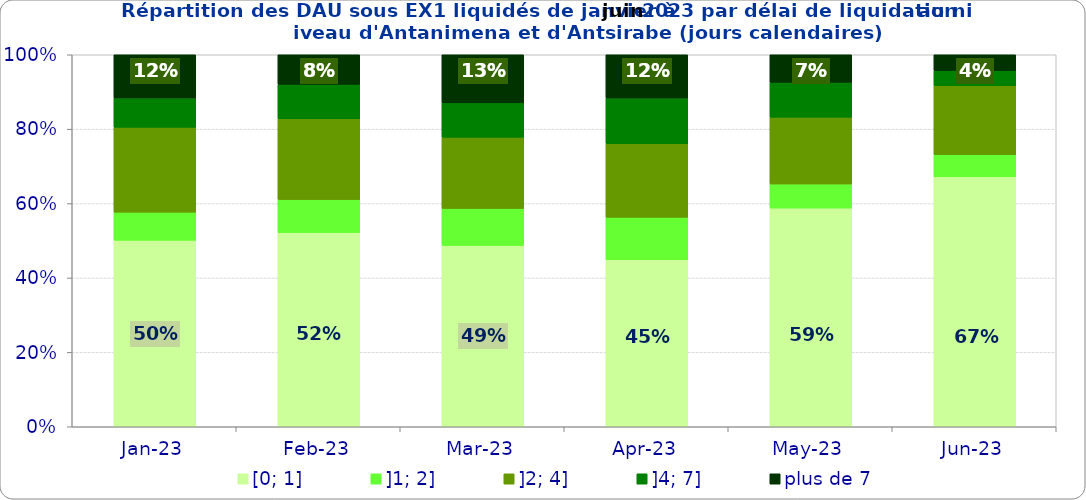
| Category | [0; 1] | ]1; 2] | ]2; 4] | ]4; 7] | plus de 7 |
|---|---|---|---|---|---|
| 2023-01-01 | 0.501 | 0.076 | 0.228 | 0.079 | 0.116 |
| 2023-02-01 | 0.522 | 0.089 | 0.217 | 0.093 | 0.08 |
| 2023-03-01 | 0.487 | 0.1 | 0.191 | 0.092 | 0.129 |
| 2023-04-01 | 0.449 | 0.114 | 0.198 | 0.123 | 0.116 |
| 2023-05-01 | 0.588 | 0.065 | 0.18 | 0.094 | 0.074 |
| 2023-06-01 | 0.672 | 0.059 | 0.185 | 0.041 | 0.043 |